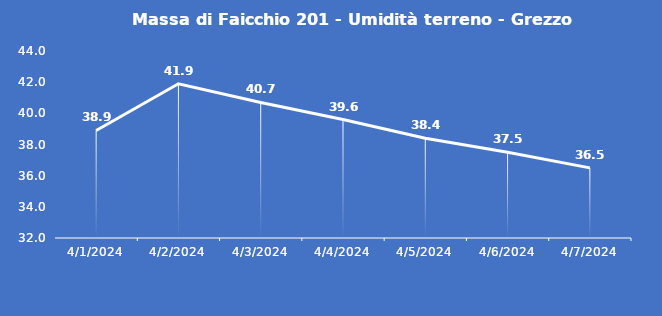
| Category | Massa di Faicchio 201 - Umidità terreno - Grezzo (%VWC) |
|---|---|
| 4/1/24 | 38.9 |
| 4/2/24 | 41.9 |
| 4/3/24 | 40.7 |
| 4/4/24 | 39.6 |
| 4/5/24 | 38.4 |
| 4/6/24 | 37.5 |
| 4/7/24 | 36.5 |